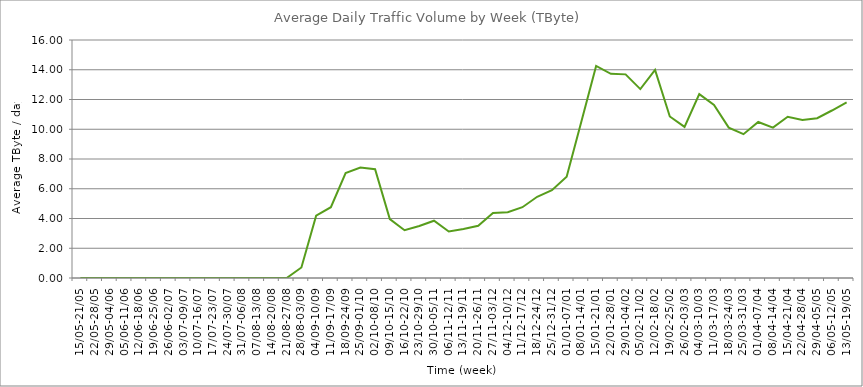
| Category | Average |
|---|---|
| 15/05-21/05 | 0 |
| 22/05-28/05 | 0 |
| 29/05-04/06 | 0 |
| 05/06-11/06 | 0 |
| 12/06-18/06 | 0 |
| 19/06-25/06 | 0 |
| 26/06-02/07 | 0 |
| 03/07-09/07 | 0 |
| 10/07-16/07 | 0 |
| 17/07-23/07 | 0 |
| 24/07-30/07 | 0 |
| 31/07-06/08 | 0 |
| 07/08-13/08 | 0 |
| 14/08-20/08 | 0 |
| 21/08-27/08 | 0 |
| 28/08-03/09 | 0.71 |
| 04/09-10/09 | 4.19 |
| 11/09-17/09 | 4.76 |
| 18/09-24/09 | 7.05 |
| 25/09-01/10 | 7.42 |
| 02/10-08/10 | 7.31 |
| 09/10-15/10 | 3.96 |
| 16/10-22/10 | 3.21 |
| 23/10-29/10 | 3.5 |
| 30/10-05/11 | 3.85 |
| 06/11-12/11 | 3.13 |
| 13/11-19/11 | 3.3 |
| 20/11-26/11 | 3.51 |
| 27/11-03/12 | 4.37 |
| 04/12-10/12 | 4.42 |
| 11/12-17/12 | 4.76 |
| 18/12-24/12 | 5.46 |
| 25/12-31/12 | 5.9 |
| 01/01-07/01 | 6.81 |
| 08/01-14/01 | 10.52 |
| 15/01-21/01 | 14.26 |
| 22/01-28/01 | 13.73 |
| 29/01-04/02 | 13.69 |
| 05/02-11/02 | 12.7 |
| 12/02-18/02 | 13.99 |
| 19/02-25/02 | 10.86 |
| 26/02-03/03 | 10.16 |
| 04/03-10/03 | 12.36 |
| 11/03-17/03 | 11.63 |
| 18/03-24/03 | 10.11 |
| 25/03-31/03 | 9.67 |
| 01/04-07/04 | 10.49 |
| 08/04-14/04 | 10.11 |
| 15/04-21/04 | 10.84 |
| 22/04-28/04 | 10.62 |
| 29/04-05/05 | 10.74 |
| 06/05-12/05 | 11.26 |
| 13/05-19/05 | 11.81 |